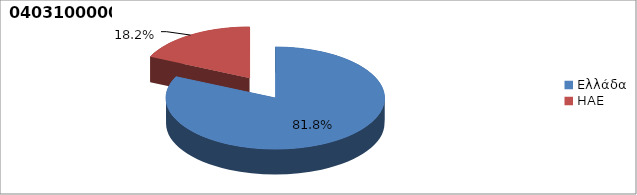
| Category | Series 0 |
|---|---|
| Ελλάδα | 0.818 |
| ΗΑΕ | 0.182 |